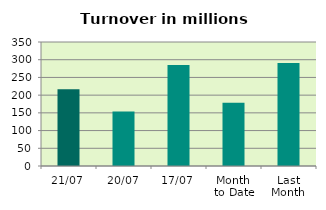
| Category | Series 0 |
|---|---|
| 21/07 | 216.977 |
| 20/07 | 153.806 |
| 17/07 | 285.305 |
| Month 
to Date | 178.704 |
| Last
Month | 290.981 |